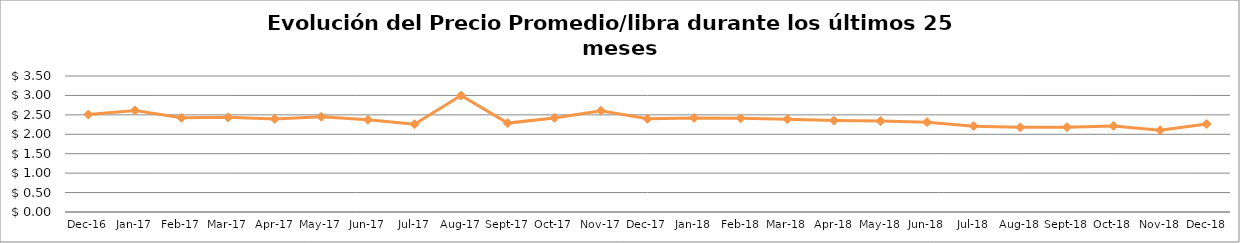
| Category | Series 0 |
|---|---|
| 2016-12-01 | 2.508 |
| 2017-01-01 | 2.615 |
| 2017-02-01 | 2.424 |
| 2017-03-01 | 2.436 |
| 2017-04-01 | 2.396 |
| 2017-05-01 | 2.452 |
| 2017-06-01 | 2.372 |
| 2017-07-01 | 2.26 |
| 2017-08-01 | 2.997 |
| 2017-09-01 | 2.288 |
| 2017-10-01 | 2.421 |
| 2017-11-01 | 2.605 |
| 2017-12-01 | 2.4 |
| 2018-01-01 | 2.42 |
| 2018-02-01 | 2.412 |
| 2018-03-01 | 2.388 |
| 2018-04-01 | 2.352 |
| 2018-05-01 | 2.341 |
| 2018-06-01 | 2.312 |
| 2018-07-01 | 2.209 |
| 2018-08-01 | 2.178 |
| 2018-09-01 | 2.184 |
| 2018-10-01 | 2.216 |
| 2018-11-01 | 2.106 |
| 2018-12-01 | 2.264 |